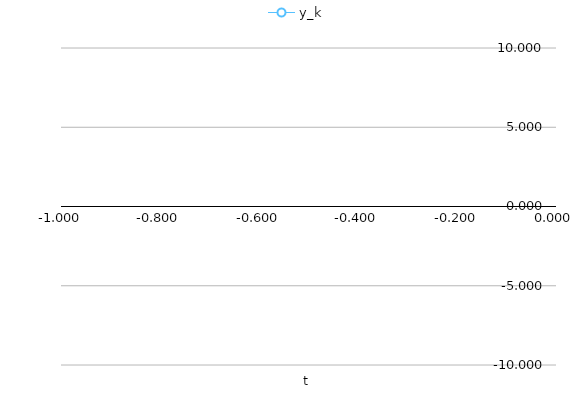
| Category | y_k |
|---|---|
| 0.0 | 4 |
| 0.1 | 3.924 |
| 0.2 | 3.846 |
| 0.3 | 3.767 |
| 0.4 | 3.688 |
| 0.5 | 3.611 |
| 0.6 | 3.536 |
| 0.7 | 3.466 |
| 0.8 | 3.402 |
| 0.9 | 3.345 |
| 1.0 | 3.295 |
| 1.1 | 3.253 |
| 1.2 | 3.22 |
| 1.3 | 3.194 |
| 1.4 | 3.175 |
| 1.5 | 3.161 |
| 1.6 | 3.152 |
| 1.7 | 3.147 |
| 1.8 | 3.144 |
| 1.9 | 3.143 |
| 2.0 | 3.142 |
| 2.1 | 3.142 |
| 2.2 | 3.142 |
| 2.3 | 3.142 |
| 2.4 | 3.142 |
| 2.5 | 3.142 |
| 2.6 | 3.142 |
| 2.7 | 3.142 |
| 2.8 | 3.142 |
| 2.9 | 3.142 |
| 3.0 | 3.142 |
| 3.1 | 3.142 |
| 3.2 | 3.142 |
| 3.3 | 3.142 |
| 3.4 | 3.142 |
| 3.5 | 3.142 |
| 3.6 | 3.142 |
| 3.7 | 3.142 |
| 3.8 | 3.142 |
| 3.9 | 3.142 |
| 4.0 | 3.142 |
| 4.1 | 3.142 |
| 4.2 | 3.142 |
| 4.3 | 3.142 |
| 4.4 | 3.142 |
| 4.5 | 3.142 |
| 4.6 | 3.142 |
| 4.7 | 3.137 |
| 4.8 | 3.192 |
| 4.9 | 2.579 |
| 5.0 | 9.746 |
| 5.1 | 5.064 |
| 5.2 | -10.332 |
| 5.3 | 3.944 |
| 5.4 | -10.457 |
| 5.5 | 8.546 |
| 5.6 | 27.388 |
| 5.7 | 48.347 |
| 5.8 | 20.248 |
| 5.9 | 52.791 |
| 6.0 | 73.888 |
| 6.1 | 33.62 |
| 6.2 | 69.565 |
| 6.3 | 90.99 |
| 6.4 | 97.311 |
| 6.5 | 102.019 |
| 6.6 | 168.306 |
| 6.7 | 96.752 |
| 6.8 | 145.089 |
| 6.9 | 193.979 |
| 7.0 | 122.839 |
| 7.1 | 88.668 |
| 7.2 | 167.06 |
| 7.3 | 96.453 |
| 7.4 | 215.719 |
| 7.5 | 357.723 |
| 7.6 | 284.269 |
| 7.7 | 483.884 |
| 7.8 | 501.262 |
| 7.9 | 261.05 |
| 8.0 | 181.805 |
| 8.1 | 63.742 |
| 8.2 | 323.869 |
| 8.3 | 221.682 |
| 8.4 | 616.051 |
| 8.5 | 747.178 |
| 8.6 | 502.316 |
| 8.7 | 321.849 |
| 8.8 | 914.094 |
| 8.9 | 986.371 |
| 9.0 | 920.971 |
| 9.1 | 543.748 |
| 9.2 | 319.637 |
| 9.3 | -393.78 |
| 9.4 | 571.301 |
| 9.5 | 24.932 |
| 9.6 | -240.839 |
| 9.7 | -1531.591 |
| 9.8 | 96.805 |
| 9.9 | 1091.254 |
| 10.0 | -703.789 |
| 10.1 | -863.252 |
| 10.2 | -2405.087 |
| 10.3 | 233.02 |
| 10.4 | 1767.544 |
| 10.5 | 4796.387 |
| 10.6 | 7464.668 |
| 10.7 | 8435.372 |
| 10.8 | 7573.189 |
| 10.9 | 12125.332 |
| 11.0 | 7046.272 |
| 11.1 | 8929.227 |
| 11.2 | 13769.34 |
| 11.3 | 15651.714 |
| 11.4 | 18034.28 |
| 11.5 | 26961.618 |
| 11.6 | 31429.479 |
| 11.7 | 40525.508 |
| 11.8 | 30143.208 |
| 11.9 | 35009.277 |
| 12.0 | 26310.925 |
| 12.1 | 24901.948 |
| 12.2 | 42772.176 |
| 12.3 | 54129.962 |
| 12.4 | 61044.633 |
| 12.5 | 52802.715 |
| 12.6 | 28046.217 |
| 12.7 | 206.029 |
| 12.8 | -31510.231 |
| 12.9 | -33557.361 |
| 13.0 | 2685.197 |
| 13.1 | 36335.179 |
| 13.2 | 13668.305 |
| 13.3 | 51068.802 |
| 13.4 | 3254.821 |
| 13.5 | 11890.423 |
| 13.6 | 47166.88 |
| 13.7 | -20302.517 |
| 13.8 | -109364.158 |
| 13.9 | -28411.928 |
| 14.0 | 36214.198 |
| 14.1 | -68637.642 |
| 14.2 | -85274.885 |
| 14.3 | -14089.078 |
| 14.4 | -147540.781 |
| 14.5 | 1048.28 |
| 14.6 | -167106.695 |
| 14.7 | 4752.988 |
| 14.8 | 62652.399 |
| 14.9 | 162866.55 |
| 15.0 | 193346.449 |
| 15.1 | 280693.824 |
| 15.2 | -55607.852 |
| 15.3 | -453210.685 |
| 15.4 | -19349.091 |
| 15.5 | -8789.767 |
| 15.6 | 205512.992 |
| 15.7 | 529145.254 |
| 15.8 | 856375.535 |
| 15.9 | 1285658.262 |
| 16.0 | 691048.162 |
| 16.1 | -191131.462 |
| 16.2 | -86227.28 |
| 16.3 | -100845.015 |
| 16.4 | 29343.017 |
| 16.5 | 712860.821 |
| 16.6 | 2024845.133 |
| 16.7 | 3072363.055 |
| 16.8 | 1293387.567 |
| 16.9 | 1597491.131 |
| 17.0 | 203588.735 |
| 17.1 | 2188142.424 |
| 17.2 | -248060.852 |
| 17.3 | -2139591.803 |
| 17.4 | -35076.798 |
| 17.5 | 2823696.65 |
| 17.6 | 6737467.894 |
| 17.7 | 10727865.35 |
| 17.8 | 6094823.68 |
| 17.9 | 11015662.365 |
| 18.0 | 14993633.316 |
| 18.1 | 9860020.807 |
| 18.2 | 12120531.269 |
| 18.3 | 13902840.44 |
| 18.4 | 5186769.305 |
| 18.5 | 3565274.877 |
| 18.6 | 10986719.533 |
| 18.7 | -794165.805 |
| 18.8 | -7626562.794 |
| 18.9 | -20315786.298 |
| 19.0 | -5382435.71 |
| 19.1 | -23230396.75 |
| 19.2 | -26600391.467 |
| 19.3 | -5491997.829 |
| 19.4 | 8914859.273 |
| 19.5 | -3862241.688 |
| 19.6 | 19269192.896 |
| 19.7 | 50278819.123 |
| 19.8 | 29831680.866 |
| 19.9 | 37142589.061 |
| 20.0 | 1897135.071 |
| 20.1 | 24128943.623 |
| 20.2 | -19081384.751 |
| 20.3 | 37737137.646 |
| 20.4 | 35452353.584 |
| 20.5 | 101494415.955 |
| 20.6 | 99187283.182 |
| 20.7 | 146399875.477 |
| 20.8 | 67449029.173 |
| 20.9 | 131089665.187 |
| 21.0 | 245195784.218 |
| 21.1 | 311318870.627 |
| 21.2 | 422485523.846 |
| 21.3 | 417559400.946 |
| 21.4 | 250045126.686 |
| 21.5 | 142611532.028 |
| 21.6 | 359195801.549 |
| 21.7 | 549585256.043 |
| 21.8 | 764118097.104 |
| 21.9 | 1057043703.436 |
| 22.0 | 1125735179.475 |
| 22.1 | 1286599149.373 |
| 22.2 | 1518533604.422 |
| 22.3 | 1787165166.904 |
| 22.4 | 1980947874.241 |
| 22.5 | 2481696351.126 |
| 22.6 | 2353283194.813 |
| 22.7 | 2149820652.608 |
| 22.8 | 1643600083.982 |
| 22.9 | 949258470.887 |
| 23.0 | 493638761.824 |
| 23.1 | 772140190.825 |
| 23.2 | 1556025853.715 |
| 23.3 | 2682118777.677 |
| 23.4 | 3265449007.911 |
| 23.5 | 3479431405.332 |
| 23.6 | 4981167357.247 |
| 23.7 | 6736788980.893 |
| 23.8 | 5358543512.059 |
| 23.9 | 3235500645.501 |
| 24.0 | 4746710230.02 |
| 24.1 | 4208306898.082 |
| 24.2 | 2170642063.025 |
| 24.3 | 2448205828.008 |
| 24.4 | 6005419806.027 |
| 24.5 | 6715516296.796 |
| 24.6 | 8044141738.031 |
| 24.7 | 6861480987.698 |
| 24.8 | 10590207438.337 |
| 24.9 | 15921687107.76 |
| 25.0 | 13428155223.21 |
| 25.1 | 18385500684.892 |
| 25.2 | 26202662100.568 |
| 25.3 | 27735048070.02 |
| 25.4 | 37411183493.05 |
| 25.5 | 28227449384.829 |
| 25.6 | 30323454414.616 |
| 25.7 | 17658115553.571 |
| 25.8 | 21153903146.647 |
| 25.9 | 23548064921.969 |
| 26.0 | 14996438905.342 |
| 26.1 | 7698953385.457 |
| 26.2 | -1573487208.66 |
| 26.3 | -20930313205.689 |
| 26.4 | -42011235969.833 |
| 26.5 | -41822870498.574 |
| 26.6 | -66716186948.484 |
| 26.7 | -86623829010.883 |
| 26.8 | -58037528776.923 |
| 26.9 | -18016216715.49 |
| 27.0 | -42518328323.033 |
| 27.1 | -7365684245.543 |
| 27.2 | 16920948617.316 |
| 27.3 | 81905429888.811 |
| 27.4 | 29832715155.072 |
| 27.5 | -47916648344.881 |
| 27.6 | -56812098485.438 |
| 27.7 | -122685047823.554 |
| 27.8 | -68612964192.407 |
| 27.9 | -132819368038.351 |
| 28.0 | -29288977672.61 |
| 28.1 | 109347685482.578 |
| 28.2 | 264205087583.61 |
| 28.3 | 218846915473.095 |
| 28.4 | 167053003726.889 |
| 28.5 | 189786182141.74 |
| 28.6 | 333898406414.168 |
| 28.7 | 571308625225.378 |
| 28.8 | 331458582623.603 |
| 28.9 | 15224374032 |
| 29.0 | -299347950138.956 |
| 29.1 | -399658840652.041 |
| 29.2 | -748663034157.451 |
| 29.3 | -1162251875155.76 |
| 29.4 | -761173854481.187 |
| 29.5 | -731486757852.752 |
| 29.6 | -610989662349.248 |
| 29.7 | -309737085815.067 |
| 29.8 | -960311592809.492 |
| 29.9 | -1391685385364.32 |
| 30.0 | -1508110396676.91 |
| 30.1 | -2084695941809.56 |
| 30.2 | -1356839874819.15 |
| 30.3 | -271820723038.1 |
| 30.4 | -1550260278731.78 |
| 30.5 | -3002225677052.53 |
| 30.6 | -4585325036008.74 |
| 30.7 | -2793367199546.24 |
| 30.8 | -2142435064985.51 |
| 30.9 | -217729762497.57 |
| 31.0 | 2338640226475.05 |
| 31.1 | 3301507915287.05 |
| 31.2 | 2355955609701.42 |
| 31.3 | 3684150482023.38 |
| 31.4 | 5789478852326.61 |
| 31.5 | 1501824264664.18 |
| 31.6 | -2461315363322.33 |
| 31.7 | 2775903006954.22 |
| 31.8 | 5592068968471.16 |
| 31.9 | 4836122307595.06 |
| 32.0 | -2285849740121.25 |
| 32.1 | 3165878662645.98 |
| 32.2 | 11844892256616.7 |
| 32.3 | 14097072132120 |
| 32.4 | 7954253280216.3 |
| 32.5 | 17613238192090.1 |
| 32.6 | 25105981954518 |
| 32.7 | 28374708901271.6 |
| 32.8 | 26161517922727.4 |
| 32.9 | 43444589890651.6 |
| 33.0 | 56099264671672.6 |
| 33.1 | 77347195403284.7 |
| 33.2 | 79515650004951.3 |
| 33.3 | 93664324751318.5 |
| 33.4 | 76577258787638.8 |
| 33.5 | 75517114594287.7 |
| 33.6 | 75098742910279.7 |
| 33.7 | 88471657003277.2 |
| 33.8 | 131457751058925.16 |
| 33.9 | 84376601302201.9 |
| 34.0 | 88924910001857.1 |
| 34.1 | 96196609079585.8 |
| 34.2 | 32830341904335.8 |
| 34.3 | 46675716845615.9 |
| 34.4 | 85142894592578.6 |
| 34.5 | 131411647958071.61 |
| 34.6 | 172857915171626.2 |
| 34.7 | 82121341872516.5 |
| 34.8 | 121845397450812.75 |
| 34.9 | 144379192331159.97 |
| 35.0 | 78179397033200 |
| 35.1 | -42129110118351 |
| 35.2 | -186866108680989 |
| 35.3 | 5781978972125 |
| 35.4 | 120341103828555.02 |
| 35.5 | 63026648292528.1 |
| 35.6 | 317228553186748.1 |
| 35.7 | 586324470031935.1 |
| 35.8 | 869013714862618.1 |
| 35.9 | 764949215404102.1 |
| 36.0 | 465418365704577.1 |
| 36.1 | 221207965199695.1 |
| 36.2 | 406305525654162.1 |
| 36.3 | -100792954522005.9 |
| 36.4 | 381241398841592.1 |
| 36.5 | 938985580850439.1 |
| 36.6 | 619071863543782.1 |
| 36.7 | 1402710835715080 |
| 36.8 | 1376121619608870 |
| 36.9 | 1105904647311910 |
| 37.0 | 388980645535719 |
| 37.1 | 880871557856821 |
| 37.2 | 590445708526218 |
| 37.3 | 1002155215880480 |
| 37.4 | -86031263983710 |
| 37.5 | -1711020204797760 |
| 37.6 | -619420021040330 |
| 37.7 | -2473158167034560 |
| 37.8 | -1388584265796190 |
| 37.9 | 318738873941180.06 |
| 38.0 | 3036276074797170 |
| 38.1 | 1813353789821580 |
| 38.2 | 5158554386715300 |
| 38.3 | 2563945000489640 |
| 38.4 | 6748388461996810 |
| 38.5 | 9883416950196250 |
| 38.6 | 7550466635506000 |
| 38.7 | 3390709729678950 |
| 38.8 | 7311462343718000 |
| 38.9 | 6649211297096660 |
| 39.0 | 7016566700816190 |
| 39.1 | 5616641458057910 |
| 39.2 | -3644177521622630 |
| 39.3 | 4415051776124520 |
| 39.4 | 10868914622652700 |
| 39.5 | 7972677452899090 |
| 39.6 | -6131366022599310 |
| 39.7 | 7487016458428890 |
| 39.8 | -9950303900263010 |
| 39.9 | -2914997481878950 |
| 40.0 | -3916616237410550 |
| 40.1 | -25396200794416600 |
| 40.2 | -39405658920450104 |
| 40.3 | -55438785180032000 |
| 40.4 | -60031516785097104 |
| 40.5 | -94819988631107104 |
| 40.6 | -64437230979350000 |
| 40.7 | -88786366088059408 |
| 40.8 | -84092856779559296 |
| 40.9 | -46012927482761600 |
| 41.0 | -92566069852751104 |
| 41.1 | -123309146304068000 |
| 41.2 | -77855419221095600 |
| 41.3 | -74762418012103296 |
| 41.4 | -20172843061686300 |
| 41.5 | 75263034504817696 |
| 41.6 | 102090276614664000 |
| 41.7 | 188269812732187008 |
| 41.8 | 304769152511116992 |
| 41.9 | 429512472555198976 |
| 42.0 | 586490543273460992 |
| 42.1 | 579796722559635968 |
| 42.2 | 677754547508801024 |
| 42.3 | 482647604191542016 |
| 42.4 | 712146195689378944 |
| 42.5 | 955078441373970944 |
| 42.6 | 1204912346504730112 |
| 42.7 | 960558268812302976 |
| 42.8 | 999878886271868032 |
| 42.9 | 1262457718917870080 |
| 43.0 | 1688990423644270080 |
| 43.1 | 1543527605995480064 |
| 43.2 | 1657341369426190080 |
| 43.3 | 1597052074427510016 |
| 43.4 | 1076807522126630016 |
| 43.5 | 386472316611366976 |
| 43.6 | 299756240786785024 |
| 43.7 | 534341700077948992 |
| 43.8 | 1388940170413959680 |
| 43.9 | 2272186192896440064 |
| 44.0 | 2867420219237700096 |
| 44.1 | 3394877979153889792 |
| 44.2 | 2316470695981300224 |
| 44.3 | 1223469888076900096 |
| 44.4 | 549339619290868992 |
| 44.5 | -655147229381870976 |
| 44.6 | -1191565113863909888 |
| 44.7 | -3462567757537650176 |
| 44.8 | -1098228349870880000 |
| 44.9 | 1718212318883480064 |
| 45.0 | 4682691672603370496 |
| 45.1 | 5661449411225400320 |
| 45.2 | 2339636158157890048 |
| 45.3 | 299286518028540032 |
| 45.4 | 4983135710027790336 |
| 45.5 | 2001211753806810112 |
| 45.6 | 3853270378753030144 |
| 45.7 | 422442555276710016 |
| 45.8 | 7295284583214300160 |
| 45.9 | 9870447807392909312 |
| 46.0 | 4597973675612919808 |
| 46.1 | -1782044061592410112 |
| 46.2 | -1977450305377530112 |
| 46.3 | -13525200935719200768 |
| 46.4 | -8350771717250249728 |
| 46.5 | -15301195755348299776 |
| 46.6 | -6150865131041699840 |
| 46.7 | -19789936707271700480 |
| 46.8 | -15872486436826200064 |
| 46.9 | 3860029972223000064 |
| 47.0 | -15009666698460100608 |
| 47.1 | -26660508194924498944 |
| 47.2 | -40016572910359699456 |
| 47.3 | -67221190712524496896 |
| 47.4 | -46416947579285299200 |
| 47.5 | -64765725910856400896 |
| 47.6 | -26069144159014699008 |
| 47.7 | -31821254130414297088 |
| 47.8 | -83200486277307793408 |
| 47.9 | -47598204278458400768 |
| 48.0 | -110724254570787995648 |
| 48.1 | -103512704257422000128 |
| 48.2 | -149568797725647994880 |
| 48.3 | -64135798468251197440 |
| 48.4 | -155824026815756009472 |
| 48.5 | -144621070682868006912 |
| 48.6 | -260051323427268984832 |
| 48.7 | -332774405504262995968 |
| 48.8 | -414964736309201993728 |
| 48.9 | -290602240672209010688 |
| 49.0 | -187107322664011005952 |
| 49.1 | -10038484833456001024 |
| 49.2 | -169075616629585018880 |
| 49.3 | 42987851451161001984 |
| 49.4 | -185485697414748995584 |
| 49.5 | 97378725016695996416 |
| 49.6 | 234418286662470008832 |
| 49.7 | 402964726105454018560 |
| 49.8 | 367492287029231026176 |
| 49.9 | 115790081586720997376 |
| 50.0 | 394864498667149000704 |
| 50.1 | -113360570110511005696 |
| 50.2 | 400497895465976004608 |
| 50.3 | 953205402272106938368 |
| 50.4 | 1455065097369700007936 |
| 50.5 | 1330437178121330098176 |
| 50.6 | 2185211189366710075392 |
| 50.7 | 3051930568046349910016 |
| 50.8 | 2486463196945570070528 |
| 50.9 | 1457894885939090030592 |
| 51.0 | 422412612597010006016 |
| 51.1 | 247611870861055000576 |
| 51.2 | -1146282507959260020736 |
| 51.3 | -2648062653900809830400 |
| 51.4 | -3687312034580729954304 |
| 51.5 | -4789718595910849527808 |
| 51.6 | -4027919564801419771904 |
| 51.7 | -3034069725118459805696 |
| 51.8 | -5712232162757529567232 |
| 51.9 | -6566347601229630144512 |
| 52.0 | -8432065508628820393984 |
| 52.1 | -10059635887502899806208 |
| 52.2 | -9077025751012599660544 |
| 52.3 | -4692903653219360047104 |
| 52.4 | -2455175396248779751424 |
| 52.5 | -8098569292627859996672 |
| 52.6 | -5090874379416800067584 |
| 52.7 | -7567911450931399491584 |
| 52.8 | -257530957462850011136 |
| 52.9 | 7209555356439030005760 |
| 53.0 | 15114429349559900569600 |
| 53.1 | 25475726238381701595136 |
| 53.2 | 33753101473874804998144 |
| 53.3 | 38462474808956003811328 |
| 53.4 | 32956386607171398270976 |
| 53.5 | 20774693242230498394112 |
| 53.6 | 5194456338697300213760 |
| 53.7 | 24157731033994798039040 |
| 53.8 | 45098702175196896296960 |
| 53.9 | 66494070491705002426368 |
| 54.0 | 63632537797220896866304 |
| 54.1 | 90900718784284993781760 |
| 54.2 | 111770502981919996641280 |
| 54.3 | 81280892249238702915584 |
| 54.4 | 71256821646534304071680 |
| 54.5 | 39938595052236396560384 |
| 54.6 | 55749786039900600008704 |
| 54.7 | 102271214167295996723200 |
| 54.8 | 152306137560442988396544 |
| 54.9 | 207680751298844003663872 |
| 55.0 | 150896653568879020212224 |
| 55.1 | 117733667123410992365568 |
| 55.2 | 202736448443986990858240 |
| 55.3 | 140580521945207008133120 |
| 55.4 | 127846612883289998884864 |
| 55.5 | 148421084410536997683200 |
| 55.6 | 120695653229076999569408 |
| 55.7 | 73597798365595198029824 |
| 55.8 | 211038342492624999415808 |
| 55.9 | 293650882130080014794752 |
| 56.0 | 266200680734016996900864 |
| 56.1 | 395034283181684975206400 |
| 56.2 | 625890899521197983137792 |
| 56.3 | 741227442853109999599616 |
| 56.4 | 650135721235428044439552 |
| 56.5 | 765799084777448969076736 |
| 56.6 | 1109407417111100025470976 |
| 56.7 | 1414222917029719906975744 |
| 56.8 | 1808894395069650016665600 |
| 56.9 | 1764211747714110033231872 |
| 57.0 | 2033411525068250029228032 |
| 57.1 | 1678916847165830108020736 |
| 57.2 | 1051143865230720032047104 |
| 57.3 | 1657552151478239871631360 |
| 57.4 | 1430686027399750043566080 |
| 57.5 | 1716728793923819954765824 |
| 57.6 | 1204268028811729979834368 |
| 57.7 | 216957411702633991766016 |
| 57.8 | 1361837005970080062767104 |
| 57.9 | 107466250443910006439936 |
| 58.0 | -1248859839693469998120960 |
| 58.1 | -2779437137051220189380608 |